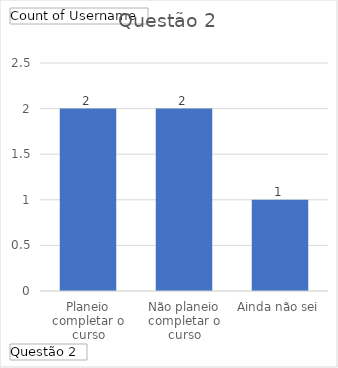
| Category | Total |
|---|---|
| Planeio completar o curso | 2 |
| Não planeio completar o curso | 2 |
| Ainda não sei | 1 |